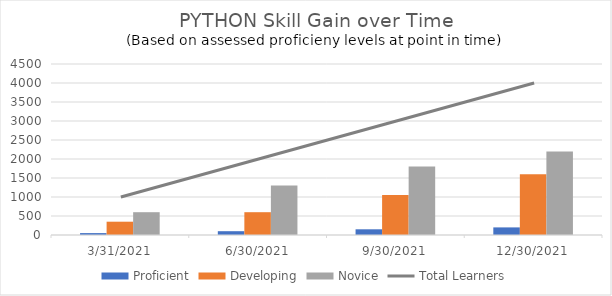
| Category | Proficient | Developing | Novice |
|---|---|---|---|
| 3/31/21 | 50 | 350 | 600 |
| 6/30/21 | 100 | 600 | 1300 |
| 9/30/21 | 150 | 1050 | 1800 |
| 12/30/21 | 200 | 1600 | 2200 |